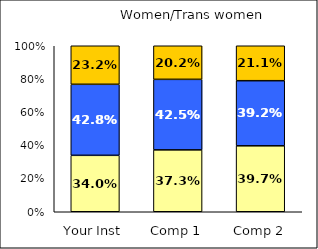
| Category | Low Science Identity | Average Science Identity | High Science Identity |
|---|---|---|---|
| Your Inst | 0.34 | 0.428 | 0.232 |
| Comp 1 | 0.373 | 0.425 | 0.202 |
| Comp 2 | 0.397 | 0.392 | 0.211 |